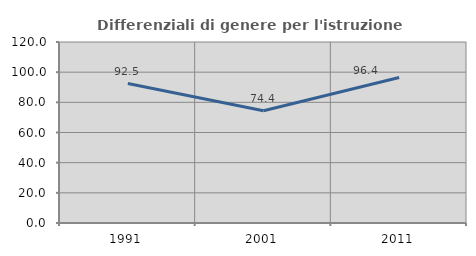
| Category | Differenziali di genere per l'istruzione superiore |
|---|---|
| 1991.0 | 92.46 |
| 2001.0 | 74.407 |
| 2011.0 | 96.44 |